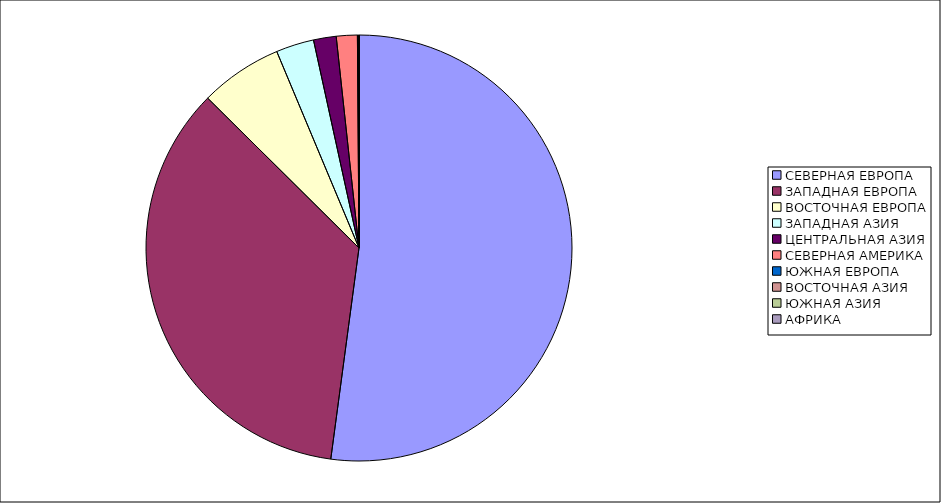
| Category | Оборот |
|---|---|
| СЕВЕРНАЯ ЕВРОПА | 52.12 |
| ЗАПАДНАЯ ЕВРОПА | 35.31 |
| ВОСТОЧНАЯ ЕВРОПА | 6.27 |
| ЗАПАДНАЯ АЗИЯ | 2.88 |
| ЦЕНТРАЛЬНАЯ АЗИЯ | 1.72 |
| СЕВЕРНАЯ АМЕРИКА | 1.59 |
| ЮЖНАЯ ЕВРОПА | 0.1 |
| ВОСТОЧНАЯ АЗИЯ | 0.01 |
| ЮЖНАЯ АЗИЯ | 0.01 |
| АФРИКА | 0 |